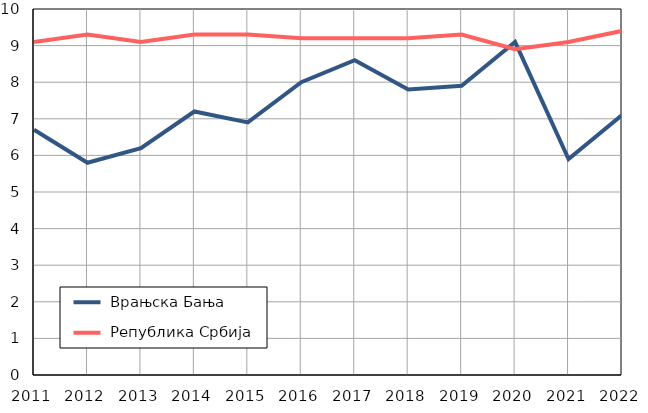
| Category |  Врањска Бања |  Република Србија |
|---|---|---|
| 2011.0 | 6.7 | 9.1 |
| 2012.0 | 5.8 | 9.3 |
| 2013.0 | 6.2 | 9.1 |
| 2014.0 | 7.2 | 9.3 |
| 2015.0 | 6.9 | 9.3 |
| 2016.0 | 8 | 9.2 |
| 2017.0 | 8.6 | 9.2 |
| 2018.0 | 7.8 | 9.2 |
| 2019.0 | 7.9 | 9.3 |
| 2020.0 | 9.1 | 8.9 |
| 2021.0 | 5.9 | 9.1 |
| 2022.0 | 7.1 | 9.4 |